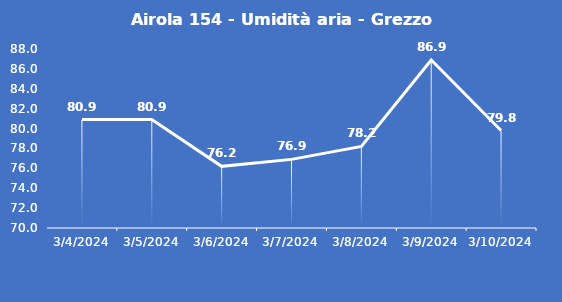
| Category | Airola 154 - Umidità aria - Grezzo (%) |
|---|---|
| 3/4/24 | 80.9 |
| 3/5/24 | 80.9 |
| 3/6/24 | 76.2 |
| 3/7/24 | 76.9 |
| 3/8/24 | 78.2 |
| 3/9/24 | 86.9 |
| 3/10/24 | 79.8 |